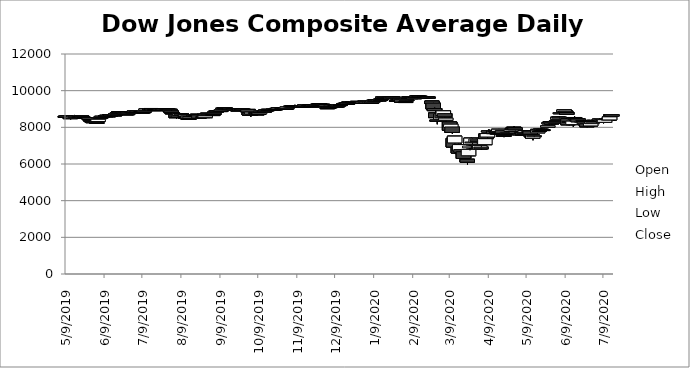
| Category | Open | High | Low | Close |
|---|---|---|---|---|
| 5/9/19 | 8602.86 | 8617.93 | 8506.44 | 8600.98 |
| 5/10/19 | 8581.09 | 8663.62 | 8475.99 | 8640.08 |
| 5/13/19 | 8528.36 | 8528.36 | 8430.92 | 8475.82 |
| 5/14/19 | 8489.49 | 8586.07 | 8489.49 | 8536.38 |
| 5/15/19 | 8502.31 | 8586.74 | 8478.23 | 8563.1 |
| 5/16/19 | 8573.82 | 8675.77 | 8573.82 | 8641.82 |
| 5/17/19 | 8593.53 | 8666.28 | 8575.19 | 8605.91 |
| 5/20/19 | 8574.12 | 8610.18 | 8549.82 | 8585.19 |
| 5/21/19 | 8615.02 | 8654.93 | 8615.02 | 8634.75 |
| 5/22/19 | 8621.08 | 8621.08 | 8579.62 | 8593.4 |
| 5/23/19 | 8559.98 | 8559.98 | 8462.12 | 8516.65 |
| 5/24/19 | 8536.1 | 8567.23 | 8498.1 | 8523.01 |
| 5/28/19 | 8527.67 | 8552.53 | 8425.44 | 8426.17 |
| 5/29/19 | 8399.98 | 8399.98 | 8311.05 | 8349.1 |
| 5/30/19 | 8355.5 | 8388.21 | 8327.52 | 8356.25 |
| 5/31/19 | 8308.58 | 8308.58 | 8250.41 | 8253.53 |
| 6/3/19 | 8261.22 | 8306.67 | 8227.11 | 8272.52 |
| 6/4/19 | 8315.28 | 8446.1 | 8315.28 | 8441.96 |
| 6/5/19 | 8474.56 | 8533.58 | 8474.34 | 8531.34 |
| 6/6/19 | 8532.66 | 8575.77 | 8496.62 | 8551.07 |
| 6/7/19 | 8574.23 | 8660.26 | 8574.23 | 8603.27 |
| 6/10/19 | 8634.19 | 8685.83 | 8626.35 | 8628.18 |
| 6/11/19 | 8658.26 | 8686.88 | 8585.73 | 8609.35 |
| 6/12/19 | 8612.24 | 8638.96 | 8607.53 | 8628.38 |
| 6/13/19 | 8642.52 | 8682.24 | 8633.7 | 8672.52 |
| 6/14/19 | 8669.15 | 8695.96 | 8636.59 | 8674.91 |
| 6/17/19 | 8678.11 | 8681.43 | 8647.3 | 8653.93 |
| 6/18/19 | 8682.95 | 8765.71 | 8682.95 | 8741.3 |
| 6/19/19 | 8741.61 | 8782.94 | 8726.86 | 8765.77 |
| 6/20/19 | 8819.35 | 8851.14 | 8768.2 | 8836.2 |
| 6/21/19 | 8834.5 | 8881.65 | 8821.08 | 8825.05 |
| 6/24/19 | 8830.48 | 8842.04 | 8792.35 | 8795.63 |
| 6/25/19 | 8796.45 | 8800.77 | 8725.83 | 8731.74 |
| 6/26/19 | 8741.91 | 8755.23 | 8712.83 | 8713.11 |
| 6/27/19 | 8718.9 | 8760.96 | 8717.82 | 8740.44 |
| 6/28/19 | 8760.05 | 8804.91 | 8760.05 | 8796.83 |
| 7/1/19 | 8849.98 | 8881.39 | 8784.72 | 8823.35 |
| 7/2/19 | 8833.59 | 8845.91 | 8800.12 | 8837.16 |
| 7/3/19 | 8852.41 | 8904.55 | 8852.41 | 8904.55 |
| 7/5/19 | 8870.58 | 8893.13 | 8801.92 | 8885.02 |
| 7/8/19 | 8864.61 | 8867.23 | 8829.03 | 8851.92 |
| 7/9/19 | 8829.64 | 8841.45 | 8804.4 | 8832.65 |
| 7/10/19 | 8853.43 | 8887.53 | 8831.42 | 8842.31 |
| 7/11/19 | 8856.25 | 8907.93 | 8845.3 | 8907.61 |
| 7/12/19 | 8924.17 | 9000.26 | 8923.37 | 8999.09 |
| 7/15/19 | 9001.99 | 9002.01 | 8978.56 | 9000.15 |
| 7/16/19 | 9010.25 | 9051.98 | 9009.78 | 9028.06 |
| 7/17/19 | 9008.55 | 9008.55 | 8928.16 | 8929.16 |
| 7/18/19 | 8928.96 | 8976.98 | 8907.96 | 8969.9 |
| 7/19/19 | 8976.98 | 9011.58 | 8948.52 | 8950.32 |
| 7/22/19 | 8961.14 | 8977.41 | 8936.62 | 8954.94 |
| 7/23/19 | 8972.09 | 9006.39 | 8956.28 | 8998.87 |
| 7/24/19 | 8963.72 | 9016.23 | 8952.5 | 8999.67 |
| 7/25/19 | 8990.54 | 8998.59 | 8928.75 | 8952.64 |
| 7/26/19 | 8961.06 | 8995.69 | 8953.54 | 8986.41 |
| 7/29/19 | 8984.17 | 9006.04 | 8975.91 | 8997.47 |
| 7/30/19 | 8973.04 | 8989.98 | 8941.81 | 8981.67 |
| 7/31/19 | 8985.1 | 9002.24 | 8838.42 | 8895.21 |
| 8/1/19 | 8895.39 | 8964.17 | 8786.27 | 8798.44 |
| 8/2/19 | 8788.05 | 8806.24 | 8720.65 | 8769.46 |
| 8/5/19 | 8711.97 | 8711.97 | 8463.48 | 8524.96 |
| 8/6/19 | 8563.68 | 8640.72 | 8524.05 | 8632.73 |
| 8/7/19 | 8578.25 | 8651.3 | 8457.08 | 8629.23 |
| 8/8/19 | 8651.67 | 8758.34 | 8641.28 | 8751.5 |
| 8/9/19 | 8740.26 | 8754.78 | 8663.5 | 8711.58 |
| 8/12/19 | 8680.29 | 8680.29 | 8569.78 | 8597.13 |
| 8/13/19 | 8587.57 | 8748.06 | 8569.16 | 8695.74 |
| 8/14/19 | 8632.48 | 8632.48 | 8461.22 | 8464.66 |
| 8/15/19 | 8474.07 | 8506.98 | 8414.93 | 8486.36 |
| 8/16/19 | 8517.48 | 8606.82 | 8517.48 | 8592.81 |
| 8/19/19 | 8638.3 | 8698.61 | 8638.3 | 8674.32 |
| 8/20/19 | 8662.31 | 8673.55 | 8618.77 | 8621.59 |
| 8/21/19 | 8674.13 | 8710.68 | 8671.96 | 8699.45 |
| 8/22/19 | 8716.92 | 8743.91 | 8650.1 | 8702.15 |
| 8/23/19 | 8671.04 | 8715.72 | 8459.01 | 8496.74 |
| 8/26/19 | 8555.94 | 8592.35 | 8519.53 | 8587.56 |
| 8/27/19 | 8629.24 | 8638.82 | 8536.76 | 8544.49 |
| 8/28/19 | 8527.27 | 8629.15 | 8507.46 | 8625.66 |
| 8/29/19 | 8690.1 | 8754.87 | 8676.24 | 8739.01 |
| 8/30/19 | 8774.85 | 8794.98 | 8726.5 | 8751.88 |
| 9/3/19 | 8696.38 | 8705.51 | 8642.31 | 8696.63 |
| 9/4/19 | 8746.64 | 8770.86 | 8735.34 | 8767.65 |
| 9/5/19 | 8820.59 | 8902.76 | 8820.59 | 8872.87 |
| 9/6/19 | 8892.42 | 8900.12 | 8863.09 | 8869.77 |
| 9/9/19 | 8885.77 | 8918.84 | 8870.56 | 8913.94 |
| 9/10/19 | 8903.68 | 8962.68 | 8885.72 | 8962.64 |
| 9/11/19 | 8967.26 | 9039.6 | 8945.17 | 9039.6 |
| 9/12/19 | 9060.09 | 9069.09 | 9017.05 | 9039.53 |
| 9/13/19 | 9054.85 | 9076.93 | 9048.09 | 9056.67 |
| 9/16/19 | 9020.08 | 9034.08 | 8999.12 | 9010.88 |
| 9/17/19 | 8994.06 | 9028.41 | 8986.97 | 9026.36 |
| 9/18/19 | 8988.4 | 9012.06 | 8928.47 | 9009.24 |
| 9/19/19 | 9019.67 | 9036.06 | 8980.77 | 8990.3 |
| 9/20/19 | 8994.34 | 9015.74 | 8937.09 | 8955.04 |
| 9/23/19 | 8932.84 | 8966.17 | 8915.5 | 8945.26 |
| 9/24/19 | 8976.24 | 9007.87 | 8895.08 | 8926.66 |
| 9/25/19 | 8939.42 | 8990.73 | 8915.5 | 8978.61 |
| 9/26/19 | 8990.31 | 8993.81 | 8934.8 | 8966.72 |
| 9/27/19 | 8993.14 | 8995.58 | 8903.97 | 8933.9 |
| 9/30/19 | 8950.75 | 8986 | 8950.75 | 8961.15 |
| 10/1/19 | 8977.89 | 9005.33 | 8826.9 | 8835.45 |
| 10/2/19 | 8786.25 | 8786.25 | 8632.6 | 8672.26 |
| 10/3/19 | 8667.13 | 8711.8 | 8567.89 | 8710.66 |
| 10/4/19 | 8730.25 | 8832.3 | 8730.25 | 8827.92 |
| 10/7/19 | 8805.4 | 8855.16 | 8774.59 | 8798.55 |
| 10/8/19 | 8733.21 | 8769 | 8683.08 | 8684.32 |
| 10/9/19 | 8732.8 | 8781.6 | 8722.51 | 8753.11 |
| 10/10/19 | 8737.3 | 8825.45 | 8732.43 | 8805.96 |
| 10/11/19 | 8866.07 | 8966.31 | 8866.07 | 8904.75 |
| 10/14/19 | 8888.1 | 8905.48 | 8873.25 | 8878.96 |
| 10/15/19 | 8886.14 | 8975.18 | 8886.14 | 8947.09 |
| 10/16/19 | 8937.24 | 8971.32 | 8930.98 | 8956.83 |
| 10/17/19 | 8969.98 | 9004.5 | 8966.52 | 8980.27 |
| 10/18/19 | 8979.5 | 8982.7 | 8931.55 | 8940.8 |
| 10/21/19 | 8969.45 | 8990.92 | 8956.86 | 8986.33 |
| 10/22/19 | 8990.32 | 9038.12 | 8959.25 | 9008.32 |
| 10/23/19 | 9010.86 | 9025.04 | 8992.08 | 9018.47 |
| 10/24/19 | 9036.52 | 9047.1 | 8981.05 | 9008.55 |
| 10/25/19 | 9004.12 | 9061.26 | 8999.97 | 9052.32 |
| 10/28/19 | 9070.94 | 9104.68 | 9050.61 | 9054.37 |
| 10/29/19 | 9036.5 | 9065.13 | 9027.73 | 9046.54 |
| 10/30/19 | 9039.37 | 9047.27 | 8986.25 | 9037.33 |
| 10/31/19 | 9030.31 | 9030.31 | 8952.34 | 8994.23 |
| 11/1/19 | 9021.52 | 9103.42 | 9021.52 | 9103.41 |
| 11/4/19 | 9128.11 | 9159.24 | 9128.11 | 9157.13 |
| 11/5/19 | 9162.31 | 9199.48 | 9155.47 | 9161.51 |
| 11/6/19 | 9165.11 | 9165.39 | 9131.12 | 9161.08 |
| 11/7/19 | 9184.63 | 9231.7 | 9174.15 | 9186.95 |
| 11/8/19 | 9181.67 | 9183.16 | 9147.68 | 9177.46 |
| 11/11/19 | 9145.34 | 9169.38 | 9126.92 | 9161.24 |
| 11/12/19 | 9163.23 | 9180.47 | 9137.63 | 9150.77 |
| 11/13/19 | 9130.64 | 9179.8 | 9123.97 | 9165.78 |
| 11/14/19 | 9159.1 | 9181.06 | 9142.97 | 9173.82 |
| 11/15/19 | 9192.04 | 9222.87 | 9184.71 | 9222.87 |
| 11/18/19 | 9215.63 | 9238.92 | 9212.09 | 9233.26 |
| 11/19/19 | 9242.46 | 9245.07 | 9191.87 | 9202.94 |
| 11/20/19 | 9184.73 | 9190.73 | 9125.13 | 9161.17 |
| 11/21/19 | 9161.12 | 9163.68 | 9128.05 | 9141.09 |
| 11/22/19 | 9166.15 | 9187.69 | 9144.25 | 9183.86 |
| 11/25/19 | 9196.75 | 9251.55 | 9196.75 | 9250.77 |
| 11/26/19 | 9253.76 | 9279.98 | 9243.52 | 9271.99 |
| 11/27/19 | 9277.85 | 9278.59 | 9252.02 | 9276.51 |
| 11/29/19 | 9260.61 | 9268.61 | 9227.62 | 9233.75 |
| 12/2/19 | 9244.48 | 9244.48 | 9145.34 | 9145.63 |
| 12/3/19 | 9071.56 | 9071.56 | 9010.66 | 9050.72 |
| 12/4/19 | 9083.36 | 9137.25 | 9082.18 | 9104.24 |
| 12/5/19 | 9125.03 | 9126.67 | 9078 | 9111.61 |
| 12/6/19 | 9159.51 | 9214.3 | 9159.51 | 9201.18 |
| 12/9/19 | 9191.58 | 9200.41 | 9167.24 | 9168.24 |
| 12/10/19 | 9164.15 | 9181.65 | 9134.47 | 9154.44 |
| 12/11/19 | 9153.24 | 9179.21 | 9135.71 | 9174.99 |
| 12/12/19 | 9174.94 | 9277.03 | 9157.38 | 9230.92 |
| 12/13/19 | 9227.75 | 9276.9 | 9209.23 | 9241.8 |
| 12/16/19 | 9266.48 | 9317.66 | 9266.48 | 9299.71 |
| 12/17/19 | 9291.39 | 9331.76 | 9290.65 | 9309.43 |
| 12/18/19 | 9320.64 | 9320.64 | 9274.48 | 9290.11 |
| 12/19/19 | 9295.24 | 9325.15 | 9294.15 | 9321.69 |
| 12/20/19 | 9381.66 | 9386.39 | 9339.66 | 9368.76 |
| 12/23/19 | 9382.37 | 9396.52 | 9371.01 | 9374.87 |
| 12/24/19 | 9378.65 | 9379.77 | 9359.93 | 9371.16 |
| 12/26/19 | 9381.04 | 9404.62 | 9375.84 | 9403.95 |
| 12/27/19 | 9417.79 | 9424.58 | 9396.33 | 9409.02 |
| 12/30/19 | 9407.26 | 9407.49 | 9341.7 | 9359.32 |
| 12/31/19 | 9347.34 | 9389.67 | 9339.6 | 9386.48 |
| 1/2/20 | 9419.82 | 9447.56 | 9388.49 | 9446.78 |
| 1/3/20 | 9354.56 | 9403.86 | 9341.08 | 9385.56 |
| 1/6/20 | 9327.9 | 9391.37 | 9320.98 | 9390.08 |
| 1/7/20 | 9373.5 | 9398.61 | 9353.78 | 9372.83 |
| 1/8/20 | 9367.53 | 9467.01 | 9361.25 | 9424.69 |
| 1/9/20 | 9451.56 | 9487.78 | 9451.56 | 9481.03 |
| 1/10/20 | 9489.68 | 9495.45 | 9436.76 | 9447.19 |
| 1/13/20 | 9456.45 | 9492.93 | 9452.98 | 9492.25 |
| 1/14/20 | 9494.99 | 9551.44 | 9494.22 | 9524.47 |
| 1/15/20 | 9528.56 | 9603.78 | 9525.13 | 9573.56 |
| 1/16/20 | 9606.84 | 9657.87 | 9606.84 | 9656.44 |
| 1/17/20 | 9648.36 | 9679.58 | 9640.46 | 9674.97 |
| 1/21/20 | 9649.26 | 9668.45 | 9600.54 | 9618.72 |
| 1/22/20 | 9642.87 | 9661.1 | 9603.19 | 9606.01 |
| 1/23/20 | 9586.67 | 9652.16 | 9540.42 | 9647.41 |
| 1/24/20 | 9658.92 | 9672.05 | 9552.26 | 9603.24 |
| 1/27/20 | 9471.05 | 9494.76 | 9445.79 | 9456.34 |
| 1/28/20 | 9483.44 | 9545.16 | 9477.38 | 9512.13 |
| 1/29/20 | 9532.98 | 9581.37 | 9526.67 | 9527.45 |
| 1/30/20 | 9488.31 | 9558.18 | 9432.66 | 9550.49 |
| 1/31/20 | 9527.61 | 9527.61 | 9339.92 | 9370.29 |
| 2/3/20 | 9394.61 | 9471.46 | 9394.61 | 9406.73 |
| 2/4/20 | 9483.21 | 9542.22 | 9483.21 | 9506.66 |
| 2/5/20 | 9574.02 | 9649.01 | 9565.03 | 9638.33 |
| 2/6/20 | 9663.95 | 9670.55 | 9617.1 | 9644.34 |
| 2/7/20 | 9618.83 | 9619.63 | 9569.98 | 9581.66 |
| 2/10/20 | 9560.98 | 9623.08 | 9559.21 | 9622.64 |
| 2/11/20 | 9659.82 | 9687.56 | 9625.8 | 9636.66 |
| 2/12/20 | 9669.39 | 9717.81 | 9669.39 | 9710.01 |
| 2/13/20 | 9680.08 | 9727.42 | 9653.95 | 9700.51 |
| 2/14/20 | 9703.95 | 9712.1 | 9650.61 | 9682.42 |
| 2/18/20 | 9662.34 | 9685.32 | 9629.69 | 9661.41 |
| 2/19/20 | 9672.26 | 9699.7 | 9666.74 | 9680.12 |
| 2/20/20 | 9673.46 | 9712.79 | 9598.01 | 9679.08 |
| 2/21/20 | 9650.31 | 9650.31 | 9567.55 | 9602.49 |
| 2/24/20 | 9436.12 | 9436.12 | 9266.51 | 9296.87 |
| 2/25/20 | 9320.42 | 9342.63 | 8973.35 | 8996.46 |
| 2/26/20 | 9025.9 | 9114.74 | 8901.22 | 8909.77 |
| 2/27/20 | 8785.43 | 8877.33 | 8527.18 | 8530.18 |
| 2/28/20 | 8374.3 | 8423.03 | 8167.25 | 8394.63 |
| 3/2/20 | 8445.48 | 8746.95 | 8355.46 | 8746.05 |
| 3/3/20 | 8758.42 | 8894.79 | 8463.46 | 8520.3 |
| 3/4/20 | 8644.56 | 8903.3 | 8621.65 | 8900.54 |
| 3/5/20 | 8748.34 | 8748.34 | 8517.05 | 8575.61 |
| 3/6/20 | 8389.98 | 8537.42 | 8291.02 | 8503.09 |
| 3/9/20 | 8294.26 | 8294.26 | 7777.52 | 7842.88 |
| 3/10/20 | 7993.01 | 8172.73 | 7772.9 | 8172.27 |
| 3/11/20 | 8019.2 | 8019.2 | 7637.81 | 7720.97 |
| 3/12/20 | 7399.9 | 7434.5 | 6914.9 | 6924.4 |
| 3/13/20 | 7149.2 | 7519.66 | 6927.34 | 7519.6 |
| 3/16/20 | 6943.35 | 7130.81 | 6582.84 | 6596.71 |
| 3/17/20 | 6690.89 | 7097.55 | 6535.79 | 7059.9 |
| 3/18/20 | 6785.7 | 6807.47 | 6323.55 | 6638.87 |
| 3/19/20 | 6615.26 | 6768.49 | 6390.69 | 6621.89 |
| 3/20/20 | 6669.43 | 6766.73 | 6281.59 | 6304.73 |
| 3/23/20 | 6261.43 | 6261.43 | 5973.2 | 6100.31 |
| 3/24/20 | 6449.59 | 6811.26 | 6428.47 | 6797.83 |
| 3/25/20 | 6880.77 | 7269.07 | 6731.59 | 6975.88 |
| 3/26/20 | 7056.52 | 7432.03 | 7040.63 | 7412.43 |
| 3/27/20 | 7199.31 | 7388.22 | 7076.2 | 7165.62 |
| 3/30/20 | 7189.09 | 7388.86 | 7126.91 | 7365.27 |
| 3/31/20 | 7316.05 | 7383.31 | 7198.05 | 7221.21 |
| 4/1/20 | 6968.09 | 7028.49 | 6797.67 | 6866.08 |
| 4/2/20 | 6806.32 | 7032.95 | 6801.3 | 7014.83 |
| 4/3/20 | 6924.27 | 6981.68 | 6767.88 | 6828.18 |
| 4/6/20 | 7054.45 | 7434.37 | 7054.45 | 7392.72 |
| 4/7/20 | 7648.73 | 7681.18 | 7376.77 | 7380.33 |
| 4/8/20 | 7471.14 | 7696.02 | 7397.12 | 7660.88 |
| 4/9/20 | 7753.59 | 7896.14 | 7709.53 | 7804.73 |
| 4/13/20 | 7792.96 | 7792.96 | 7580.65 | 7650.63 |
| 4/14/20 | 7775.85 | 7875.83 | 7745.69 | 7830.89 |
| 4/15/20 | 7710.81 | 7710.81 | 7583.66 | 7656.83 |
| 4/16/20 | 7669.15 | 7679.54 | 7553.79 | 7659.7 |
| 4/17/20 | 7779.33 | 7913.09 | 7759.33 | 7896.55 |
| 4/20/20 | 7835.79 | 7835.79 | 7652.98 | 7673.59 |
| 4/21/20 | 7564.83 | 7582.93 | 7462.62 | 7500.98 |
| 4/22/20 | 7629.23 | 7676.03 | 7584.79 | 7630.38 |
| 4/23/20 | 7669.09 | 7761.57 | 7627.45 | 7636.44 |
| 4/24/20 | 7678.14 | 7743.07 | 7599.99 | 7724.05 |
| 4/27/20 | 7773.56 | 7887.78 | 7760.44 | 7860.19 |
| 4/28/20 | 7954.49 | 7992.94 | 7850.56 | 7871.68 |
| 4/29/20 | 8006.87 | 8071.71 | 7962.39 | 8008.44 |
| 4/30/20 | 7965.83 | 7965.83 | 7819.19 | 7862.52 |
| 5/1/20 | 7779.84 | 7779.84 | 7631.33 | 7658.99 |
| 5/4/20 | 7614.79 | 7652.29 | 7535.31 | 7644.19 |
| 5/5/20 | 7710.79 | 7780.7 | 7688.28 | 7694.53 |
| 5/6/20 | 7726.45 | 7738.57 | 7575.73 | 7578.68 |
| 5/7/20 | 7645.09 | 7736.87 | 7643.6 | 7654.66 |
| 5/8/20 | 7733.22 | 7834.23 | 7733.22 | 7824.07 |
| 5/11/20 | 7783.48 | 7822.22 | 7709.75 | 7778.02 |
| 5/12/20 | 7796.74 | 7821.23 | 7624.5 | 7625.26 |
| 5/13/20 | 7599.76 | 7599.76 | 7417.29 | 7478.46 |
| 5/14/20 | 7405.44 | 7572.87 | 7293.37 | 7571.68 |
| 5/15/20 | 7511.61 | 7564.23 | 7465.61 | 7542.66 |
| 5/18/20 | 7702.07 | 7926.16 | 7702.07 | 7889.39 |
| 5/19/20 | 7881.52 | 7899.7 | 7772.5 | 7773.22 |
| 5/20/20 | 7863.97 | 7946.45 | 7863.97 | 7899.45 |
| 5/21/20 | 7890.88 | 7939.16 | 7830.91 | 7858.37 |
| 5/22/20 | 7857.22 | 7882.79 | 7812.3 | 7878.64 |
| 5/26/20 | 8006.58 | 8135.14 | 8006.58 | 8079.96 |
| 5/27/20 | 8192.24 | 8256.34 | 8102.3 | 8255.95 |
| 5/28/20 | 8311.74 | 8335.82 | 8218.79 | 8239.27 |
| 5/29/20 | 8201.92 | 8274.67 | 8130.06 | 8239.6 |
| 6/1/20 | 8227.63 | 8287.69 | 8188.05 | 8271.8 |
| 6/2/20 | 8318.92 | 8368.38 | 8290.68 | 8368.23 |
| 6/3/20 | 8438.49 | 8578.16 | 8438.49 | 8554.09 |
| 6/4/20 | 8536.34 | 8591.35 | 8481.21 | 8553.37 |
| 6/5/20 | 8746.54 | 8911.47 | 8746.54 | 8797.87 |
| 6/8/20 | 8840.64 | 8964.08 | 8840.64 | 8962.47 |
| 6/9/20 | 8893.04 | 8893.04 | 8776.07 | 8825.49 |
| 6/10/20 | 8807.39 | 8824.92 | 8691.79 | 8708.66 |
| 6/11/20 | 8475.97 | 8475.97 | 8116.77 | 8137.92 |
| 6/12/20 | 8324.13 | 8403.06 | 8113.41 | 8280.24 |
| 6/15/20 | 8146.94 | 8382.63 | 8023.27 | 8339.43 |
| 6/16/20 | 8536.47 | 8613.67 | 8362.2 | 8465.82 |
| 6/17/20 | 8487.53 | 8506.28 | 8409.59 | 8425.29 |
| 6/18/20 | 8383.12 | 8431.2 | 8351.03 | 8408.05 |
| 6/19/20 | 8457.19 | 8521.34 | 8280.65 | 8288.65 |
| 6/22/20 | 8275.24 | 8343.91 | 8217.86 | 8332.6 |
| 6/23/20 | 8377.89 | 8414.94 | 8348.65 | 8370.31 |
| 6/24/20 | 8310.86 | 8310.86 | 8115.02 | 8163.9 |
| 6/25/20 | 8131 | 8226.03 | 8062.38 | 8223.63 |
| 6/26/20 | 8198.25 | 8198.25 | 8004.98 | 8028.39 |
| 6/29/20 | 8075.56 | 8221.31 | 8044.76 | 8219.33 |
| 6/30/20 | 8200.97 | 8325.3 | 8183.55 | 8292.07 |
| 7/1/20 | 8341.99 | 8409.81 | 8290.15 | 8305.59 |
| 7/2/20 | 8378.72 | 8459.69 | 8327.7 | 8344.08 |
| 7/6/20 | 8401.87 | 8485.76 | 8401.87 | 8449.43 |
| 7/7/20 | 8393.94 | 8416.84 | 8337.36 | 8344.36 |
| 7/8/20 | 8347.5 | 8409.96 | 8320.27 | 8401.4 |
| 7/9/20 | 8394.14 | 8395.95 | 8215.3 | 8277.25 |
| 7/10/20 | 8273.2 | 8426.88 | 8273.2 | 8415.93 |
| 7/13/20 | 8456.82 | 8566.91 | 8405.67 | 8416.33 |
| 7/14/20 | 8402.78 | 8589.97 | 8396.09 | 8572.4 |
| 7/15/20 | 8683.94 | 8708.94 | 8621.55 | 8667.57 |
| 7/16/20 | 8637.31 | 8712.23 | 8610.12 | 8677.43 |